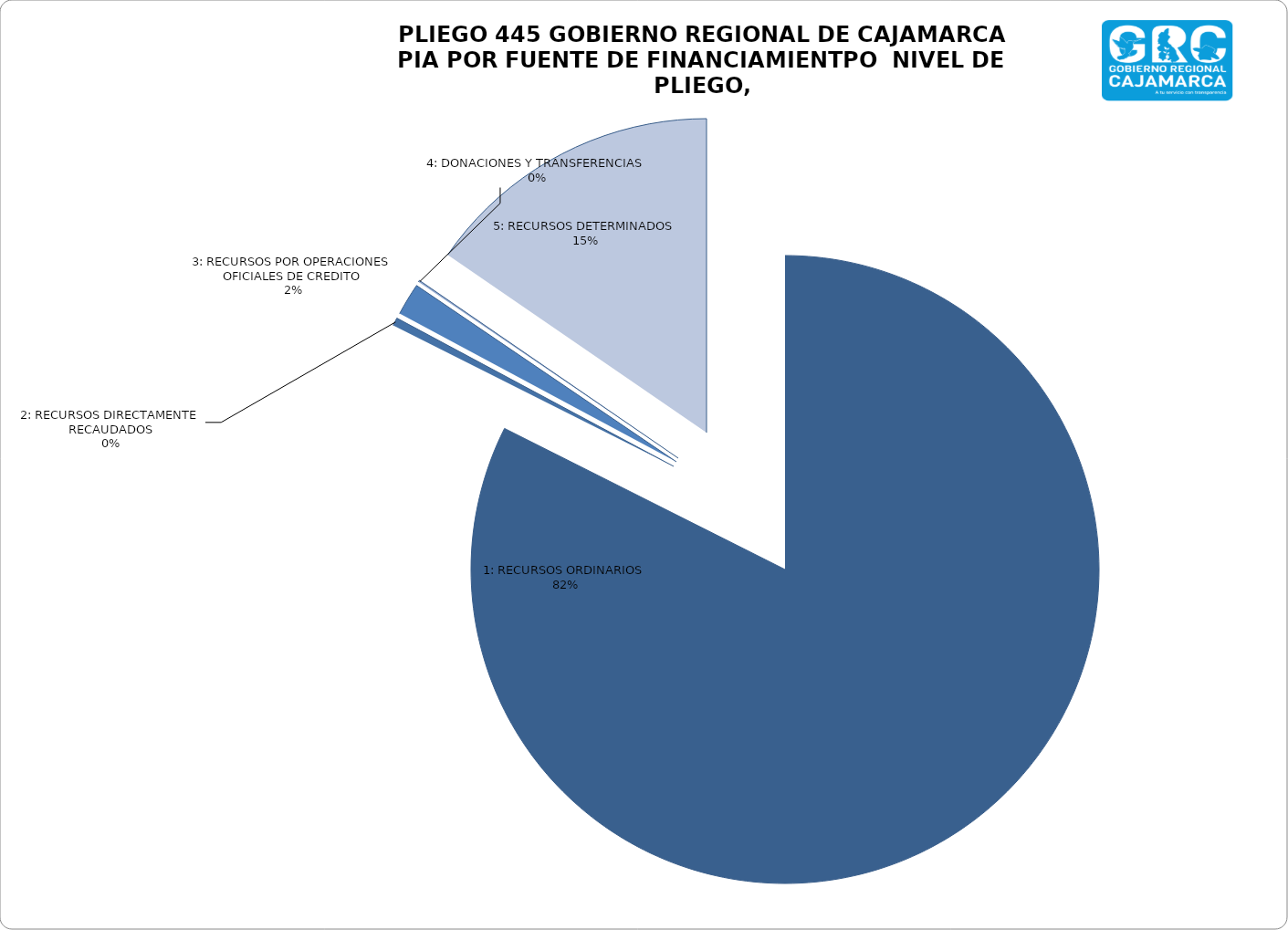
| Category | PIA |
|---|---|
| 1: RECURSOS ORDINARIOS | 1986566471 |
| 2: RECURSOS DIRECTAMENTE RECAUDADOS | 9869154 |
| 3: RECURSOS POR OPERACIONES OFICIALES DE CREDITO | 40091954 |
| 4: DONACIONES Y TRANSFERENCIAS | 2146353 |
| 5: RECURSOS DETERMINADOS | 371703833 |